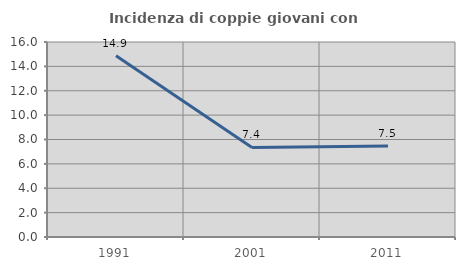
| Category | Incidenza di coppie giovani con figli |
|---|---|
| 1991.0 | 14.865 |
| 2001.0 | 7.353 |
| 2011.0 | 7.463 |